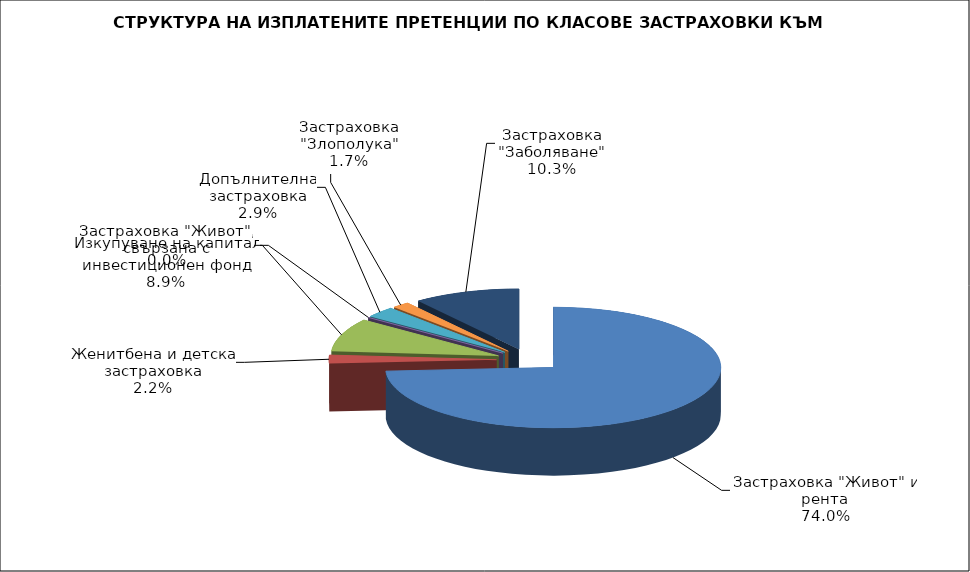
| Category | 49 239 911 1 461 656 5 926 923 0 1 954 264 1 110 221 6 825 843 |
|---|---|
| Застраховка "Живот" и рента | 49239910.601 |
| Женитбена и детска застраховка | 1461656.28 |
| Застраховка "Живот", свързана с инвестиционен фонд | 5926922.93 |
| Изкупуване на капитал | 0 |
| Допълнителна застраховка | 1954263.832 |
| Застраховка "Злополука" | 1110220.77 |
| Застраховка "Заболяване" | 6825843.49 |